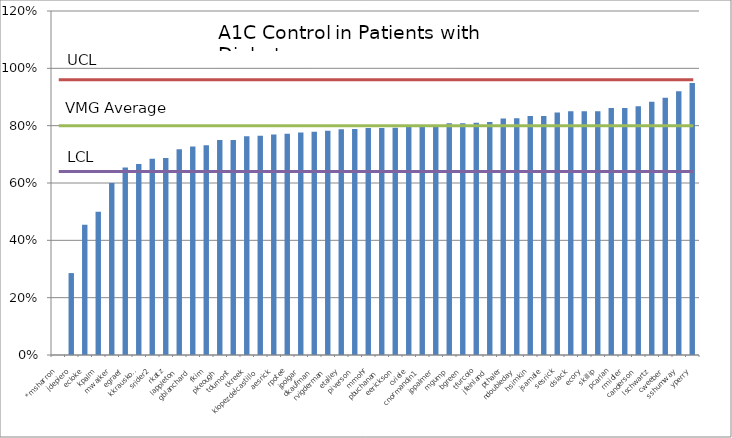
| Category | Series 0 |
|---|---|
| *msharron | 0 |
| jdepiero | 0.286 |
| ecloke | 0.455 |
| kpalm | 0.5 |
| mwalker | 0.6 |
| egraef | 0.654 |
| kkrauskopf | 0.667 |
| srider2 | 0.684 |
| rkatz | 0.688 |
| lappleton | 0.718 |
| gblanchard | 0.727 |
| fkim | 0.731 |
| pkeough | 0.75 |
| tdumont | 0.75 |
| tkreek | 0.763 |
| klopezdelcastillo | 0.765 |
| aesrick | 0.769 |
| rpotee | 0.772 |
| jpolgar | 0.776 |
| dkaufman | 0.778 |
| rvigderman | 0.783 |
| etalley | 0.787 |
| piverson | 0.788 |
| mmohr | 0.792 |
| pbuchanan | 0.792 |
| eerickson | 0.792 |
| cviele | 0.795 |
| cnormandin1 | 0.796 |
| jppalmer | 0.797 |
| mgump | 0.808 |
| bgreen | 0.809 |
| tfurcolo | 0.81 |
| jfeinland | 0.812 |
| pthaler | 0.825 |
| ndoubleday | 0.826 |
| hsimkin | 0.833 |
| jsamale | 0.833 |
| sesrick | 0.846 |
| dslack | 0.85 |
| ecory | 0.85 |
| skillip | 0.85 |
| pcarlan | 0.862 |
| rmidler | 0.862 |
| canderson | 0.868 |
| lschwartz | 0.884 |
| cweeber | 0.898 |
| sshumway | 0.92 |
| yperry | 0.949 |